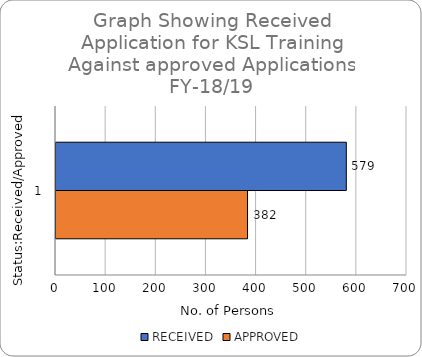
| Category | RECEIVED | APPROVED |
|---|---|---|
| 0 | 579 | 382 |